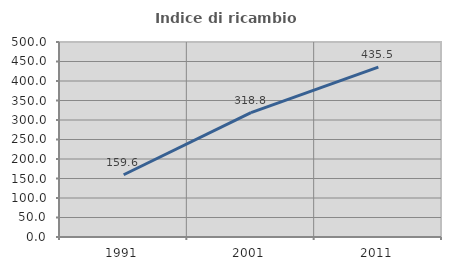
| Category | Indice di ricambio occupazionale  |
|---|---|
| 1991.0 | 159.574 |
| 2001.0 | 318.75 |
| 2011.0 | 435.484 |